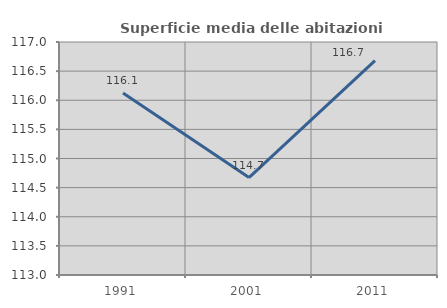
| Category | Superficie media delle abitazioni occupate |
|---|---|
| 1991.0 | 116.123 |
| 2001.0 | 114.673 |
| 2011.0 | 116.68 |